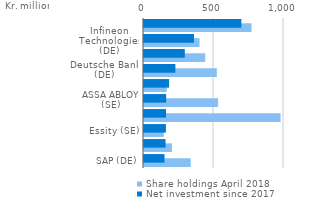
| Category | Share holdings April 2018 | Net investment since 2017 |
|---|---|---|
| SAP (DE) | 333.7 | 146.3 |
| Tencent Holdings (KY) | 199.5 | 153.8 |
| Essity (SE) | 141.5 | 156.4 |
| Alphabet (US) | 975.4 | 157.2 |
| ASSA ABLOY (SE) | 529.4 | 158.4 |
| Boozt (SE) | 161.9 | 179.2 |
| Deutsche Bank (DE) | 520.2 | 224.2 |
| Alibaba Group Holding (KY) | 437.2 | 291.5 |
| Infineon Technologies (DE) | 396.9 | 357 |
| Teva Pharmaceutical (IL) | 768 | 695.3 |